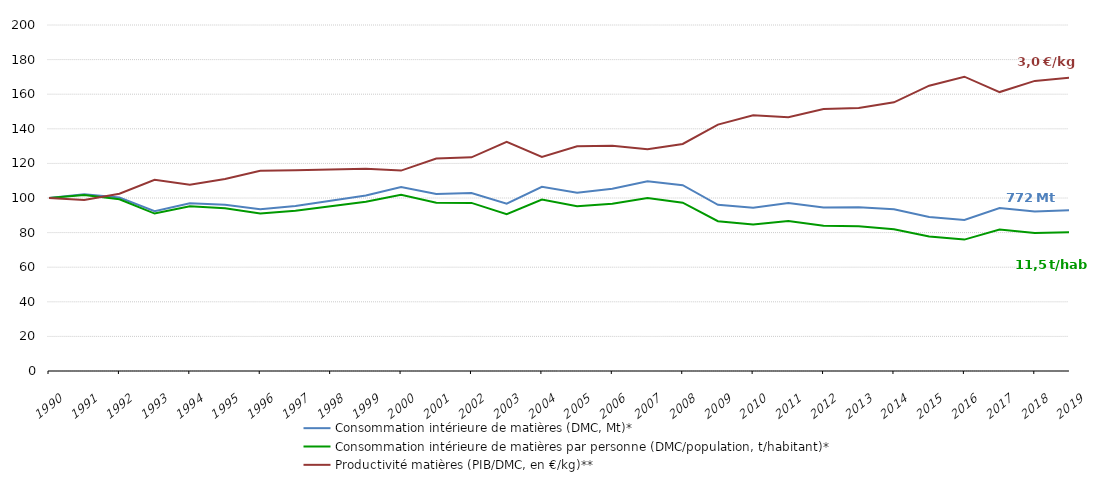
| Category | Consommation intérieure de matières (DMC, Mt)* | Consommation intérieure de matières par personne (DMC/population, t/habitant)* | Productivité matières (PIB/DMC, en €/kg)** |
|---|---|---|---|
| 1990.0 | 100 | 100 | 100 |
| 1991.0 | 102.214 | 101.716 | 98.86 |
| 1992.0 | 100.229 | 99.245 | 102.43 |
| 1993.0 | 92.336 | 90.994 | 110.486 |
| 1994.0 | 96.98 | 95.218 | 107.676 |
| 1995.0 | 96.114 | 94.032 | 110.936 |
| 1996.0 | 93.443 | 91.101 | 115.719 |
| 1997.0 | 95.404 | 92.695 | 115.988 |
| 1998.0 | 98.364 | 95.239 | 116.535 |
| 1999.0 | 101.42 | 97.833 | 116.891 |
| 2000.0 | 106.365 | 101.888 | 115.829 |
| 2001.0 | 102.293 | 97.289 | 122.83 |
| 2002.0 | 102.905 | 97.163 | 123.486 |
| 2003.0 | 96.725 | 90.678 | 132.456 |
| 2004.0 | 106.429 | 99.089 | 123.787 |
| 2005.0 | 103.104 | 95.259 | 129.903 |
| 2006.0 | 105.388 | 96.665 | 130.201 |
| 2007.0 | 109.668 | 99.934 | 128.154 |
| 2008.0 | 107.376 | 97.293 | 131.222 |
| 2009.0 | 96.071 | 86.585 | 142.45 |
| 2010.0 | 94.356 | 84.634 | 147.866 |
| 2011.0 | 97.171 | 86.729 | 146.732 |
| 2012.0 | 94.458 | 83.923 | 151.418 |
| 2013.0 | 94.648 | 83.677 | 151.985 |
| 2014.0 | 93.514 | 81.968 | 155.299 |
| 2015.0 | 89.042 | 77.704 | 164.915 |
| 2016.0 | 87.267 | 75.95 | 170.112 |
| 2017.0 | 94.181 | 81.757 | 161.235 |
| 2018.0 | 92.243 | 79.816 | 167.692 |
| 2019.0 | 92.933 | 80.232 | 169.515 |